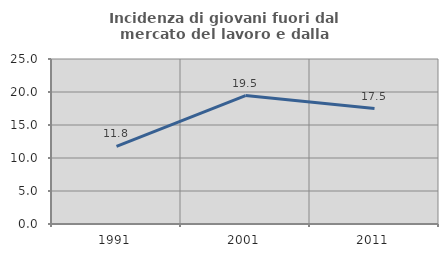
| Category | Incidenza di giovani fuori dal mercato del lavoro e dalla formazione  |
|---|---|
| 1991.0 | 11.765 |
| 2001.0 | 19.453 |
| 2011.0 | 17.5 |